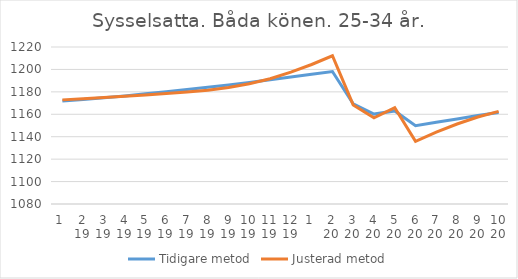
| Category | Tidigare metod | Justerad metod |
|---|---|---|
| 0 | 1171.94 | 1172.85 |
| 1 | 1173.22 | 1173.94 |
| 2 | 1174.69 | 1175.02 |
| 3 | 1176.4 | 1176.14 |
| 4 | 1178.29 | 1177.29 |
| 5 | 1180.21 | 1178.46 |
| 6 | 1182.15 | 1179.78 |
| 7 | 1184.15 | 1181.51 |
| 8 | 1186.21 | 1183.88 |
| 9 | 1188.37 | 1187.2 |
| 10 | 1190.71 | 1191.74 |
| 11 | 1193.18 | 1197.54 |
| 12 | 1195.65 | 1204.4 |
| 13 | 1198.12 | 1212.19 |
| 14 | 1169.4 | 1168.37 |
| 15 | 1160.19 | 1156.84 |
| 16 | 1162.98 | 1165.85 |
| 17 | 1149.87 | 1135.93 |
| 18 | 1152.85 | 1144.05 |
| 19 | 1155.88 | 1151.33 |
| 20 | 1158.85 | 1157.55 |
| 21 | 1161.61 | 1162.63 |